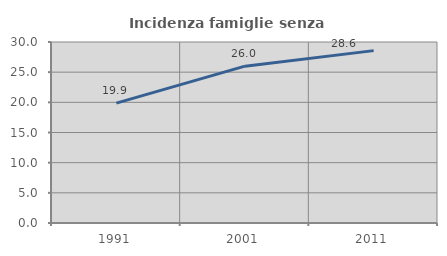
| Category | Incidenza famiglie senza nuclei |
|---|---|
| 1991.0 | 19.868 |
| 2001.0 | 25.997 |
| 2011.0 | 28.571 |